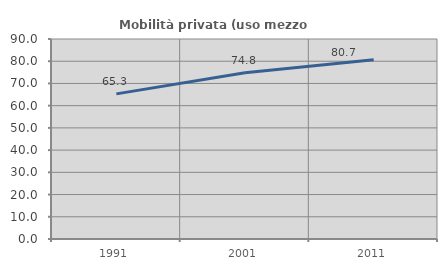
| Category | Mobilità privata (uso mezzo privato) |
|---|---|
| 1991.0 | 65.306 |
| 2001.0 | 74.831 |
| 2011.0 | 80.701 |